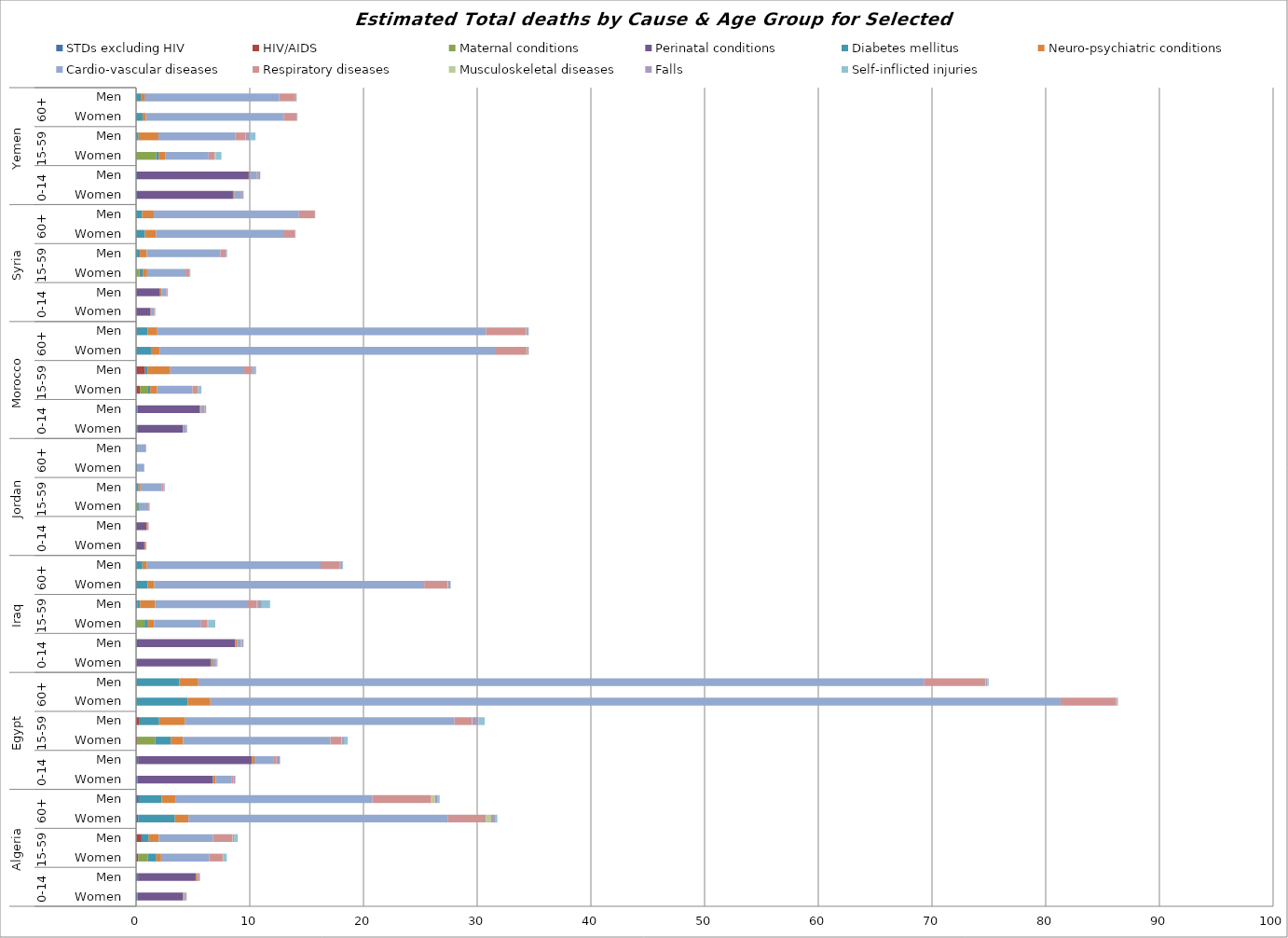
| Category | STDs excluding HIV | HIV/AIDS | Maternal conditions | Perinatal conditions | Diabetes mellitus | Neuro-psychiatric conditions | Cardio-vascular diseases | Respiratory diseases | Musculoskeletal diseases | Falls | Self-inflicted injuries |
|---|---|---|---|---|---|---|---|---|---|---|---|
| 0 | 0.126 | 0.017 | 0.007 | 3.971 | 0.01 | 0.095 | 0.131 | 0.068 | 0.003 | 0.019 | 0.006 |
| 1 | 0.158 | 0.017 | 0 | 5.065 | 0.005 | 0.137 | 0.126 | 0.08 | 0.006 | 0.032 | 0.007 |
| 2 | 0.013 | 0.17 | 0.852 | 0 | 0.748 | 0.419 | 4.228 | 1.188 | 0.039 | 0.04 | 0.284 |
| 3 | 0.023 | 0.46 | 0 | 0 | 0.635 | 0.878 | 4.779 | 1.714 | 0.035 | 0.104 | 0.316 |
| 4 | 0.209 | 0.003 | 0 | 0 | 3.203 | 1.195 | 22.828 | 3.329 | 0.464 | 0.331 | 0.211 |
| 5 | 0.237 | 0.01 | 0 | 0 | 2.002 | 1.202 | 17.336 | 5.165 | 0.322 | 0.211 | 0.217 |
| 6 | 0.115 | 0.012 | 0 | 6.634 | 0.024 | 0.203 | 1.389 | 0.184 | 0.01 | 0.151 | 0.024 |
| 7 | 0.168 | 0.012 | 0 | 9.98 | 0.016 | 0.232 | 1.719 | 0.222 | 0.004 | 0.314 | 0 |
| 8 | 0.007 | 0.078 | 1.593 | 0.001 | 1.368 | 1.086 | 12.954 | 0.96 | 0.07 | 0.158 | 0.335 |
| 9 | 0.004 | 0.304 | 0 | 0.015 | 1.701 | 2.29 | 23.679 | 1.548 | 0.032 | 0.545 | 0.547 |
| 10 | 0.004 | 0.001 | 0 | 0.006 | 4.534 | 1.99 | 74.771 | 4.902 | 0.052 | 0.085 | 0.018 |
| 11 | 0.012 | 0.007 | 0 | 0.006 | 3.79 | 1.659 | 63.852 | 5.386 | 0.044 | 0.124 | 0.103 |
| 12 | 0.037 | 0 | 0 | 6.53 | 0.006 | 0.146 | 0.317 | 0.055 | 0.009 | 0.056 | 0.018 |
| 13 | 0.047 | 0 | 0 | 8.665 | 0.003 | 0.152 | 0.354 | 0.076 | 0.007 | 0.125 | 0.023 |
| 14 | 0.042 | 0 | 0.706 | 0 | 0.239 | 0.59 | 4.143 | 0.516 | 0.033 | 0.079 | 0.62 |
| 15 | 0.104 | 0 | 0 | 0 | 0.249 | 1.319 | 8.083 | 0.877 | 0.039 | 0.383 | 0.733 |
| 16 | 0.068 | 0 | 0 | 0 | 0.947 | 0.593 | 23.732 | 2.065 | 0.056 | 0.162 | 0.054 |
| 17 | 0.06 | 0 | 0 | 0 | 0.497 | 0.396 | 15.278 | 1.709 | 0.029 | 0.162 | 0.074 |
| 18 | 0.004 | 0 | 0 | 0.725 | 0 | 0.086 | 0.066 | 0.027 | 0.004 | 0.004 | 0.002 |
| 19 | 0.005 | 0 | 0 | 0.907 | 0 | 0.08 | 0.073 | 0.034 | 0.001 | 0.014 | 0 |
| 20 | 0 | 0 | 0.093 | 0 | 0.144 | 0.079 | 0.764 | 0.065 | 0.055 | 0.011 | 0 |
| 21 | 0 | 0.003 | 0 | 0 | 0.218 | 0.173 | 1.841 | 0.144 | 0.03 | 0.106 | 0.013 |
| 22 | 0 | 0 | 0 | 0 | 0.074 | 0.002 | 0.627 | 0.033 | 0 | 0 | 0.001 |
| 23 | 0 | 0 | 0 | 0 | 0.071 | 0.006 | 0.79 | 0.028 | 0 | 0.004 | 0 |
| 24 | 0.071 | 0.029 | 0 | 4.016 | 0.002 | 0.049 | 0.248 | 0.036 | 0.003 | 0.039 | 0.004 |
| 25 | 0.096 | 0.03 | 0 | 5.494 | 0.002 | 0.069 | 0.322 | 0.06 | 0.003 | 0.083 | 0.006 |
| 26 | 0.018 | 0.319 | 0.723 | 0 | 0.186 | 0.597 | 3.114 | 0.471 | 0.02 | 0.042 | 0.26 |
| 27 | 0.016 | 0.771 | 0 | 0 | 0.208 | 2.011 | 6.425 | 0.74 | 0.017 | 0.198 | 0.176 |
| 28 | 0.012 | 0.008 | 0 | 0 | 1.288 | 0.759 | 29.489 | 2.782 | 0.062 | 0.113 | 0.027 |
| 29 | 0.032 | 0.028 | 0 | 0 | 0.968 | 0.837 | 28.908 | 3.511 | 0.048 | 0.162 | 0.048 |
| 30 | 0.006 | 0 | 0.002 | 1.267 | 0.009 | 0.089 | 0.233 | 0.078 | 0 | 0.012 | 0.001 |
| 31 | 0.01 | 0 | 0 | 2.098 | 0.006 | 0.118 | 0.44 | 0.099 | 0 | 0.026 | 0.001 |
| 32 | 0.021 | 0 | 0.276 | 0 | 0.287 | 0.388 | 3.372 | 0.367 | 0.004 | 0.024 | 0.04 |
| 33 | 0.002 | 0 | 0 | 0 | 0.333 | 0.605 | 6.48 | 0.465 | 0.007 | 0.056 | 0.057 |
| 34 | 0.002 | 0 | 0 | 0 | 0.772 | 0.991 | 11.184 | 1.04 | 0.008 | 0.026 | 0.002 |
| 35 | 0.002 | 0 | 0 | 0 | 0.533 | 1.017 | 12.772 | 1.404 | 0.002 | 0.024 | 0 |
| 36 | 0.07 | 0 | 0 | 8.45 | 0.006 | 0.135 | 0.592 | 0.098 | 0.009 | 0.091 | 0.011 |
| 37 | 0.08 | 0 | 0 | 9.831 | 0.003 | 0.131 | 0.579 | 0.121 | 0.005 | 0.164 | 0.014 |
| 38 | 0.005 | 0 | 1.754 | 0 | 0.22 | 0.616 | 3.782 | 0.528 | 0.031 | 0.069 | 0.501 |
| 39 | 0.012 | 0 | 0 | 0 | 0.209 | 1.744 | 6.773 | 0.868 | 0.022 | 0.366 | 0.509 |
| 40 | 0.002 | 0 | 0 | 0 | 0.568 | 0.299 | 12.102 | 1.136 | 0.026 | 0.051 | 0.014 |
| 41 | 0.004 | 0 | 0 | 0 | 0.411 | 0.321 | 11.851 | 1.413 | 0.019 | 0.079 | 0.029 |